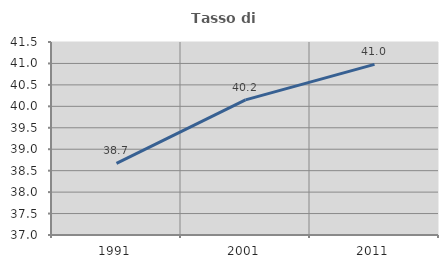
| Category | Tasso di occupazione   |
|---|---|
| 1991.0 | 38.669 |
| 2001.0 | 40.152 |
| 2011.0 | 40.978 |